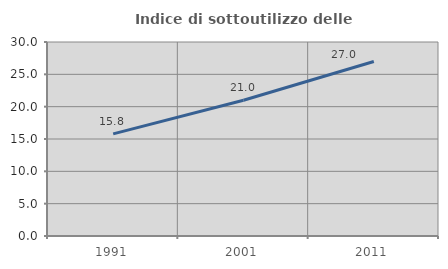
| Category | Indice di sottoutilizzo delle abitazioni  |
|---|---|
| 1991.0 | 15.798 |
| 2001.0 | 20.984 |
| 2011.0 | 26.99 |